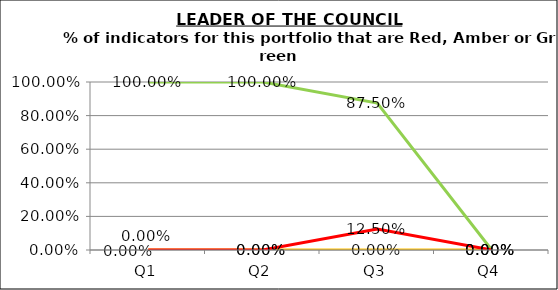
| Category | Green | Amber | Red |
|---|---|---|---|
| Q1 | 1 | 0 | 0 |
| Q2 | 1 | 0 | 0 |
| Q3 | 0.875 | 0 | 0.125 |
| Q4 | 0 | 0 | 0 |